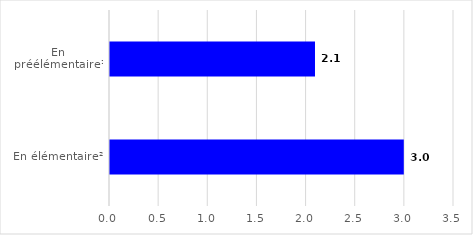
| Category | Series 0 |
|---|---|
| En préélémentaire¹ | 2.086 |
| En élémentaire² | 2.989 |